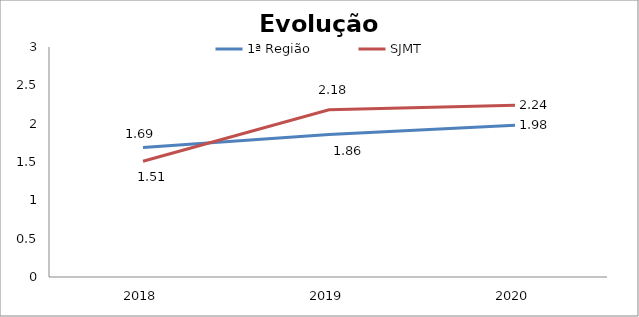
| Category | 1ª Região | SJMT |
|---|---|---|
| 0 | 1.69 | 1.51 |
| 1 | 1.86 | 2.18 |
| 2 | 1.98 | 2.24 |